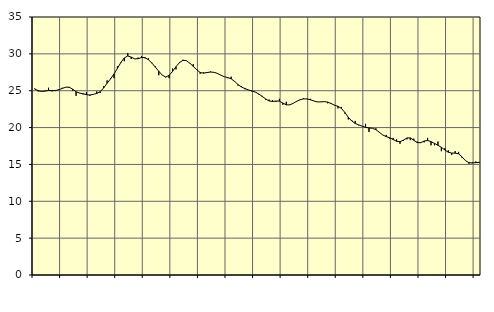
| Category | Piggar | Series 1 |
|---|---|---|
| nan | 25.3 | 25.22 |
| 87.0 | 24.9 | 25.01 |
| 87.0 | 24.9 | 24.89 |
| 87.0 | 25 | 24.95 |
| nan | 25.4 | 25.03 |
| 88.0 | 24.9 | 25.02 |
| 88.0 | 25.1 | 25.02 |
| 88.0 | 25.2 | 25.13 |
| nan | 25.4 | 25.31 |
| 89.0 | 25.5 | 25.48 |
| 89.0 | 25.4 | 25.48 |
| 89.0 | 25 | 25.21 |
| nan | 24.3 | 24.86 |
| 90.0 | 24.7 | 24.68 |
| 90.0 | 24.5 | 24.59 |
| 90.0 | 24.8 | 24.47 |
| nan | 24.3 | 24.42 |
| 91.0 | 24.5 | 24.5 |
| 91.0 | 24.9 | 24.63 |
| 91.0 | 24.7 | 24.87 |
| nan | 25.6 | 25.38 |
| 92.0 | 26.4 | 26.01 |
| 92.0 | 26.7 | 26.6 |
| 92.0 | 26.7 | 27.27 |
| nan | 28.3 | 28.03 |
| 93.0 | 28.9 | 28.83 |
| 93.0 | 29 | 29.45 |
| 93.0 | 30.1 | 29.71 |
| nan | 29.3 | 29.56 |
| 94.0 | 29.3 | 29.32 |
| 94.0 | 29.5 | 29.34 |
| 94.0 | 29.7 | 29.5 |
| nan | 29.4 | 29.49 |
| 95.0 | 29.4 | 29.2 |
| 95.0 | 28.8 | 28.75 |
| 95.0 | 28.3 | 28.2 |
| nan | 27.1 | 27.64 |
| 96.0 | 27.1 | 27.12 |
| 96.0 | 26.8 | 26.86 |
| 96.0 | 26.7 | 27.08 |
| nan | 28 | 27.62 |
| 97.0 | 27.9 | 28.26 |
| 97.0 | 28.9 | 28.81 |
| 97.0 | 29.2 | 29.12 |
| nan | 29.1 | 29.08 |
| 98.0 | 28.7 | 28.74 |
| 98.0 | 28.6 | 28.3 |
| 98.0 | 27.9 | 27.85 |
| nan | 27.3 | 27.47 |
| 99.0 | 27.5 | 27.38 |
| 99.0 | 27.4 | 27.47 |
| 99.0 | 27.6 | 27.53 |
| nan | 27.5 | 27.5 |
| 0.0 | 27.4 | 27.35 |
| 0.0 | 27.1 | 27.11 |
| 0.0 | 26.9 | 26.9 |
| nan | 26.7 | 26.78 |
| 1.0 | 26.9 | 26.62 |
| 1.0 | 26.2 | 26.26 |
| 1.0 | 25.7 | 25.83 |
| nan | 25.6 | 25.5 |
| 2.0 | 25.2 | 25.29 |
| 2.0 | 25.1 | 25.11 |
| 2.0 | 24.9 | 24.97 |
| nan | 24.8 | 24.82 |
| 3.0 | 24.5 | 24.56 |
| 3.0 | 24.3 | 24.23 |
| 3.0 | 23.8 | 23.89 |
| nan | 23.8 | 23.61 |
| 4.0 | 23.7 | 23.54 |
| 4.0 | 23.5 | 23.6 |
| 4.0 | 23.9 | 23.58 |
| nan | 23.1 | 23.33 |
| 5.0 | 23.5 | 23.08 |
| 5.0 | 23.1 | 23.08 |
| 5.0 | 23.3 | 23.29 |
| nan | 23.5 | 23.56 |
| 6.0 | 23.8 | 23.77 |
| 6.0 | 24 | 23.89 |
| 6.0 | 23.9 | 23.89 |
| nan | 23.9 | 23.77 |
| 7.0 | 23.6 | 23.61 |
| 7.0 | 23.5 | 23.48 |
| 7.0 | 23.5 | 23.48 |
| nan | 23.5 | 23.52 |
| 8.0 | 23.3 | 23.46 |
| 8.0 | 23.2 | 23.26 |
| 8.0 | 23 | 23.04 |
| nan | 22.6 | 22.88 |
| 9.0 | 22.8 | 22.6 |
| 9.0 | 21.9 | 22.05 |
| 9.0 | 21.1 | 21.4 |
| nan | 21 | 20.89 |
| 10.0 | 20.9 | 20.56 |
| 10.0 | 20.3 | 20.36 |
| 10.0 | 20.2 | 20.2 |
| nan | 20.5 | 20.03 |
| 11.0 | 19.4 | 19.95 |
| 11.0 | 19.9 | 19.9 |
| 11.0 | 19.9 | 19.72 |
| nan | 19.4 | 19.36 |
| 12.0 | 19 | 18.99 |
| 12.0 | 19 | 18.78 |
| 12.0 | 18.5 | 18.62 |
| nan | 18.6 | 18.38 |
| 13.0 | 18.4 | 18.14 |
| 13.0 | 17.8 | 18.08 |
| 13.0 | 18.2 | 18.3 |
| nan | 18.4 | 18.59 |
| 14.0 | 18.3 | 18.6 |
| 14.0 | 18.5 | 18.28 |
| 14.0 | 18.1 | 17.96 |
| nan | 17.9 | 17.95 |
| 15.0 | 18 | 18.17 |
| 15.0 | 18.6 | 18.25 |
| 15.0 | 17.6 | 18.09 |
| nan | 17.6 | 17.85 |
| 16.0 | 18.1 | 17.6 |
| 16.0 | 16.8 | 17.32 |
| 16.0 | 17.2 | 16.96 |
| nan | 16.9 | 16.66 |
| 17.0 | 16.3 | 16.54 |
| 17.0 | 16.8 | 16.53 |
| 17.0 | 16.7 | 16.44 |
| nan | 15.9 | 16.02 |
| 18.0 | 15.5 | 15.51 |
| 18.0 | 15.1 | 15.24 |
| 18.0 | 15.3 | 15.2 |
| nan | 15.4 | 15.25 |
| 19.0 | 15.2 | 15.29 |